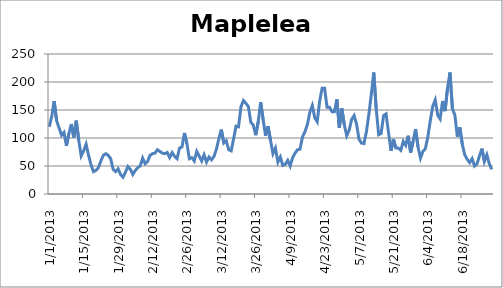
| Category | Mapleleaf |
|---|---|
| 1/1/13 | 120 |
| 1/2/13 | 138 |
| 1/3/13 | 166 |
| 1/4/13 | 131 |
| 1/5/13 | 118 |
| 1/6/13 | 105 |
| 1/7/13 | 110 |
| 1/8/13 | 86 |
| 1/9/13 | 108 |
| 1/10/13 | 125 |
| 1/11/13 | 101 |
| 1/12/13 | 131 |
| 1/13/13 | 96 |
| 1/14/13 | 68 |
| 1/15/13 | 77 |
| 1/16/13 | 89 |
| 1/17/13 | 69 |
| 1/18/13 | 52 |
| 1/19/13 | 40 |
| 1/20/13 | 42 |
| 1/21/13 | 47 |
| 1/22/13 | 59 |
| 1/23/13 | 69 |
| 1/24/13 | 72 |
| 1/25/13 | 69 |
| 1/26/13 | 63 |
| 1/27/13 | 44 |
| 1/28/13 | 40 |
| 1/29/13 | 45 |
| 1/30/13 | 35 |
| 1/31/13 | 30 |
| 2/1/13 | 39 |
| 2/2/13 | 49 |
| 2/3/13 | 44 |
| 2/4/13 | 35 |
| 2/5/13 | 42 |
| 2/6/13 | 47 |
| 2/7/13 | 50 |
| 2/8/13 | 64 |
| 2/9/13 | 54 |
| 2/10/13 | 58 |
| 2/11/13 | 69 |
| 2/12/13 | 72 |
| 2/13/13 | 73 |
| 2/14/13 | 79 |
| 2/15/13 | 76 |
| 2/16/13 | 73 |
| 2/17/13 | 72 |
| 2/18/13 | 74 |
| 2/19/13 | 65 |
| 2/20/13 | 74 |
| 2/21/13 | 67 |
| 2/22/13 | 63 |
| 2/23/13 | 82 |
| 2/24/13 | 84 |
| 2/25/13 | 109 |
| 2/26/13 | 90 |
| 2/27/13 | 63 |
| 2/28/13 | 65 |
| 3/1/13 | 59 |
| 3/2/13 | 76 |
| 3/3/13 | 68 |
| 3/4/13 | 59 |
| 3/5/13 | 70 |
| 3/6/13 | 57 |
| 3/7/13 | 66 |
| 3/8/13 | 61 |
| 3/9/13 | 67 |
| 3/10/13 | 80 |
| 3/11/13 | 99 |
| 3/12/13 | 115 |
| 3/13/13 | 91 |
| 3/14/13 | 95 |
| 3/15/13 | 79 |
| 3/16/13 | 77 |
| 3/17/13 | 99 |
| 3/18/13 | 121 |
| 3/19/13 | 120 |
| 3/20/13 | 156 |
| 3/21/13 | 167 |
| 3/22/13 | 162 |
| 3/23/13 | 156 |
| 3/24/13 | 128 |
| 3/25/13 | 123 |
| 3/26/13 | 105 |
| 3/27/13 | 129 |
| 3/28/13 | 164 |
| 3/29/13 | 133 |
| 3/30/13 | 104 |
| 3/31/13 | 121 |
| 4/1/13 | 96 |
| 4/2/13 | 72 |
| 4/3/13 | 82 |
| 4/4/13 | 57 |
| 4/5/13 | 66 |
| 4/6/13 | 51 |
| 4/7/13 | 53 |
| 4/8/13 | 60 |
| 4/9/13 | 50 |
| 4/10/13 | 65 |
| 4/11/13 | 73 |
| 4/12/13 | 79 |
| 4/13/13 | 80 |
| 4/14/13 | 102 |
| 4/15/13 | 111 |
| 4/16/13 | 124 |
| 4/17/13 | 146 |
| 4/18/13 | 158 |
| 4/19/13 | 136 |
| 4/20/13 | 129 |
| 4/21/13 | 166 |
| 4/22/13 | 189 |
| 4/23/13 | 189 |
| 4/24/13 | 155 |
| 4/25/13 | 155 |
| 4/26/13 | 147 |
| 4/27/13 | 147 |
| 4/28/13 | 169 |
| 4/29/13 | 118 |
| 4/30/13 | 153 |
| 5/1/13 | 124 |
| 5/2/13 | 104 |
| 5/3/13 | 114 |
| 5/4/13 | 133 |
| 5/5/13 | 140 |
| 5/6/13 | 125 |
| 5/7/13 | 98 |
| 5/8/13 | 91 |
| 5/9/13 | 90 |
| 5/10/13 | 111 |
| 5/11/13 | 142 |
| 5/12/13 | 178 |
| 5/13/13 | 217 |
| 5/14/13 | 152 |
| 5/15/13 | 106 |
| 5/16/13 | 108 |
| 5/17/13 | 140 |
| 5/18/13 | 143 |
| 5/19/13 | 110 |
| 5/20/13 | 77 |
| 5/21/13 | 98 |
| 5/22/13 | 82 |
| 5/23/13 | 82 |
| 5/24/13 | 78 |
| 5/25/13 | 94 |
| 5/26/13 | 87 |
| 5/27/13 | 104 |
| 5/28/13 | 74 |
| 5/29/13 | 94 |
| 5/30/13 | 116 |
| 5/31/13 | 84 |
| 6/1/13 | 64 |
| 6/2/13 | 76 |
| 6/3/13 | 81 |
| 6/4/13 | 102 |
| 6/5/13 | 131 |
| 6/6/13 | 157 |
| 6/7/13 | 168 |
| 6/8/13 | 141 |
| 6/9/13 | 134 |
| 6/10/13 | 166 |
| 6/11/13 | 148 |
| 6/12/13 | 189 |
| 6/13/13 | 217 |
| 6/14/13 | 152 |
| 6/15/13 | 141 |
| 6/16/13 | 102 |
| 6/17/13 | 119 |
| 6/18/13 | 89 |
| 6/19/13 | 70 |
| 6/20/13 | 62 |
| 6/21/13 | 56 |
| 6/22/13 | 63 |
| 6/23/13 | 50 |
| 6/24/13 | 54 |
| 6/25/13 | 68 |
| 6/26/13 | 81 |
| 6/27/13 | 58 |
| 6/28/13 | 70 |
| 6/29/13 | 54 |
| 6/30/13 | 44 |